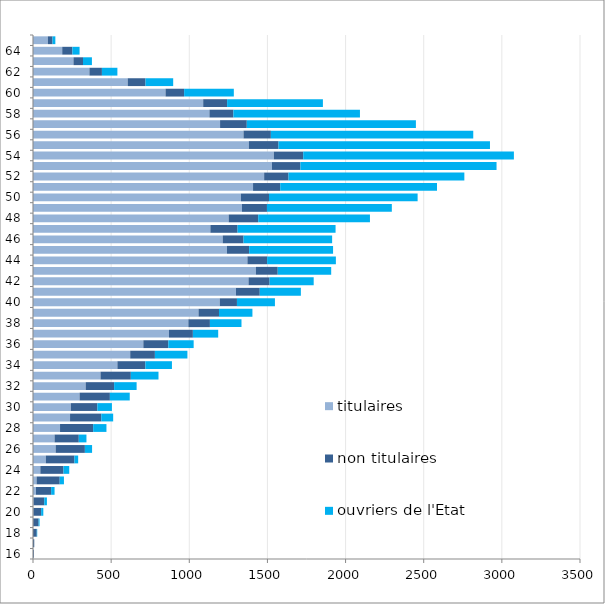
| Category | titulaires | non titulaires | ouvriers de l'Etat |
|---|---|---|---|
| 16.0 | 0 | 5 | 0 |
| 17.0 | 0 | 8 | 0 |
| 18.0 | 0 | 24 | 3 |
| 19.0 | 1 | 35 | 6 |
| 20.0 | 3 | 49 | 14 |
| 21.0 | 5 | 67 | 17 |
| 22.0 | 19 | 97 | 22 |
| 23.0 | 23 | 148 | 27 |
| 24.0 | 47 | 148 | 37 |
| 25.0 | 82 | 183 | 24 |
| 26.0 | 145 | 187 | 46 |
| 27.0 | 138 | 155 | 49 |
| 28.0 | 173 | 212 | 85 |
| 29.0 | 237 | 200 | 76 |
| 30.0 | 242 | 170 | 93 |
| 31.0 | 298 | 194 | 127 |
| 32.0 | 337 | 182 | 144 |
| 33.0 | 432 | 194 | 177 |
| 34.0 | 540 | 179 | 170 |
| 35.0 | 622 | 158 | 208 |
| 36.0 | 706 | 160 | 162 |
| 37.0 | 870 | 153 | 162 |
| 38.0 | 994 | 138 | 202 |
| 39.0 | 1059 | 131 | 214 |
| 40.0 | 1195 | 110 | 243 |
| 41.0 | 1299 | 152 | 263 |
| 42.0 | 1379 | 135 | 282 |
| 43.0 | 1426 | 140 | 342 |
| 44.0 | 1372 | 126 | 440 |
| 45.0 | 1241 | 142 | 537 |
| 46.0 | 1214 | 133 | 567 |
| 47.0 | 1135 | 174 | 627 |
| 48.0 | 1252 | 189 | 715 |
| 49.0 | 1337 | 160 | 799 |
| 50.0 | 1330 | 180 | 951 |
| 51.0 | 1408 | 174 | 1003 |
| 52.0 | 1479 | 156 | 1125 |
| 53.0 | 1529 | 182 | 1255 |
| 54.0 | 1541 | 188 | 1348 |
| 55.0 | 1381 | 190 | 1353 |
| 56.0 | 1347 | 175 | 1295 |
| 57.0 | 1197 | 171 | 1082 |
| 58.0 | 1129 | 153 | 810 |
| 59.0 | 1089 | 153 | 613 |
| 60.0 | 848 | 119 | 318 |
| 61.0 | 606 | 114 | 177 |
| 62.0 | 361 | 80 | 99 |
| 63.0 | 259 | 61 | 57 |
| 64.0 | 187 | 65 | 46 |
| 65.0 | 95 | 30 | 18 |